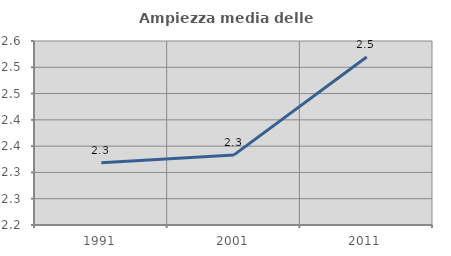
| Category | Ampiezza media delle famiglie |
|---|---|
| 1991.0 | 2.318 |
| 2001.0 | 2.333 |
| 2011.0 | 2.519 |